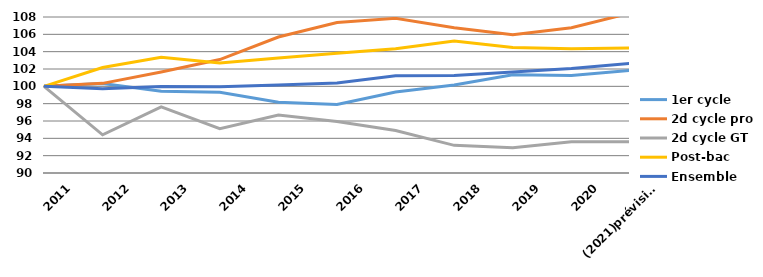
| Category | 1er cycle | 2d cycle pro | 2d cycle GT | Post-bac | Ensemble |
|---|---|---|---|---|---|
| 2011 | 100 | 100 | 100 | 100 | 100 |
| 2012 | 100.339 | 100.343 | 94.405 | 102.171 | 99.71 |
| 2013 | 99.421 | 101.653 | 97.625 | 103.367 | 99.974 |
| 2014 | 99.317 | 103.091 | 95.115 | 102.701 | 99.939 |
| 2015 | 98.161 | 105.694 | 96.681 | 103.256 | 100.162 |
| 2016 | 97.907 | 107.367 | 95.95 | 103.823 | 100.383 |
| 2017 | 99.342 | 107.846 | 94.896 | 104.329 | 101.222 |
| 2018 | 100.151 | 106.756 | 93.189 | 105.229 | 101.245 |
| 2019 | 101.344 | 105.955 | 92.902 | 104.477 | 101.648 |
| 2020 | 101.249 | 106.754 | 93.617 | 104.341 | 102.05 |
| (2021)prévisions | 101.838 | 108.445 | 93.612 | 104.428 | 102.649 |